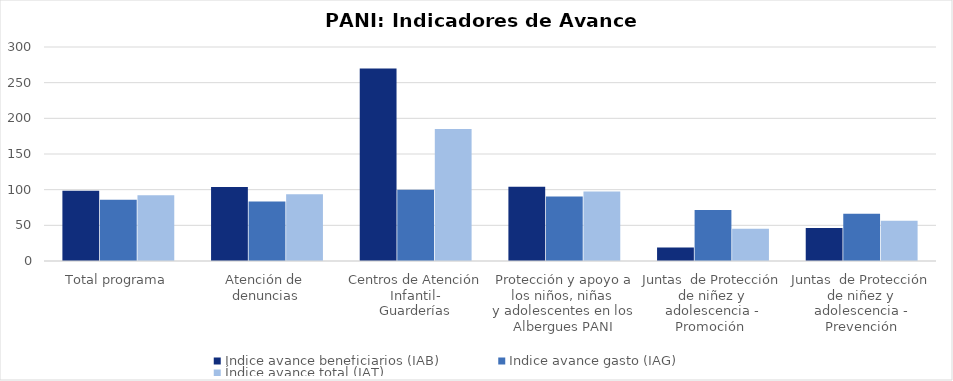
| Category | Índice avance beneficiarios (IAB)  | Índice avance gasto (IAG) | Índice avance total (IAT)  |
|---|---|---|---|
| Total programa | 98.426 | 85.705 | 92.066 |
| Atención de 
denuncias | 103.614 | 83.444 | 93.529 |
| Centros de Atención Infantil-
Guarderías | 269.83 | 99.996 | 184.913 |
| Protección y apoyo a los niños, niñas 
y adolescentes en los Albergues PANI | 104.076 | 90.554 | 97.315 |
| Juntas  de Protección de niñez y adolescencia - Promoción  | 18.878 | 71.387 | 45.133 |
| Juntas  de Protección de niñez y adolescencia - Prevención | 46.257 | 66.326 | 56.292 |